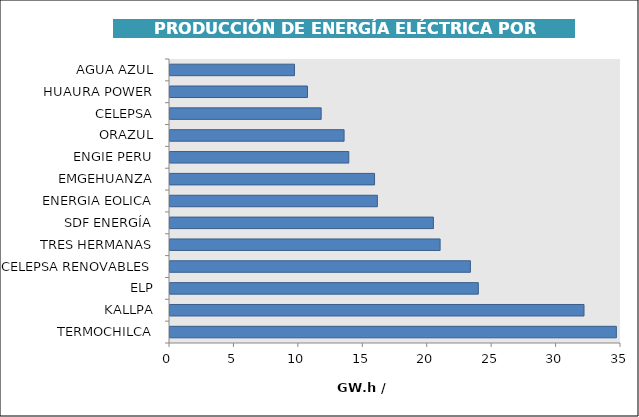
| Category | Series 0 |
|---|---|
| TERMOCHILCA | 34.641 |
| KALLPA | 32.129 |
| ELP | 23.928 |
| CELEPSA RENOVABLES | 23.312 |
| TRES HERMANAS | 20.962 |
| SDF ENERGÍA | 20.441 |
| ENERGIA EOLICA | 16.093 |
| EMGEHUANZA | 15.875 |
| ENGIE PERU | 13.873 |
| ORAZUL | 13.51 |
| CELEPSA | 11.732 |
| HUAURA POWER | 10.67 |
| AGUA AZUL | 9.66 |